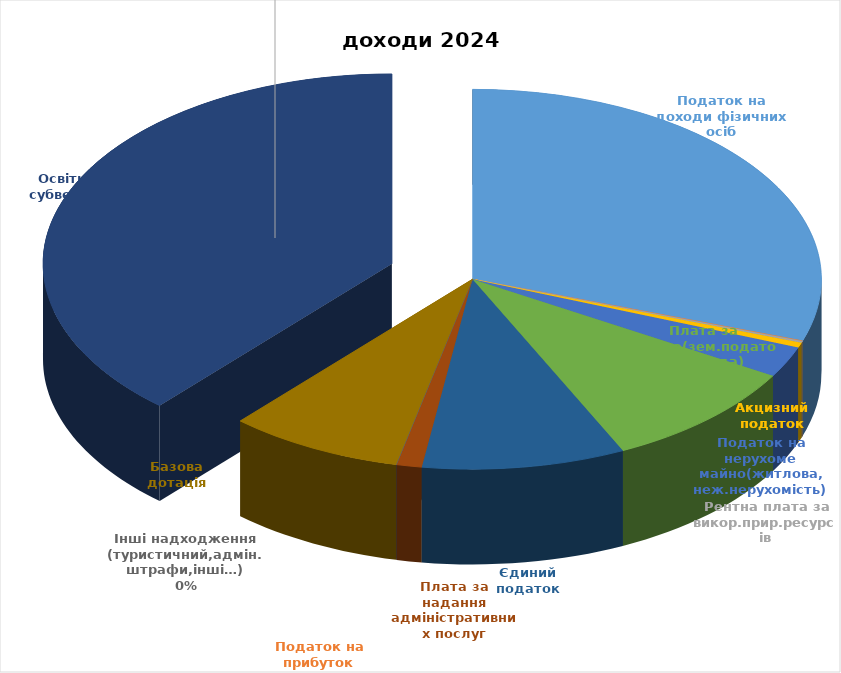
| Category | Series 0 |
|---|---|
| Податок на доходи фізичних осіб | 10215608 |
| Податок на прибуток | 1100 |
| Рентна плата за викор.прир.ресурсів | 51150 |
| Акцизний податок | 147001 |
| Податок на нерухоме майно(житлова, неж.нерухомість) | 892600 |
| Плата за землю(зем.податок, оренда) | 3179000 |
| Єдиний податок | 3176000 |
| Плата за надання адміністративних послуг | 392000 |
| Інші надходження (туристичний,адмін.штрафи,інші…) | 10115 |
| Базова дотація | 2727200 |
| Освітня субвенція | 12965900 |